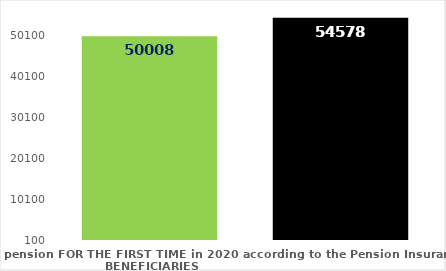
| Category | broj korisnika |
|---|---|
| Pension beneficiaries entitled to pension FOR THE FIRST TIME in 2020 according to the Pension Insurance Act  - NEW BENEFICIARIES | 50008 |
| Pension beneficiaries whose pension entitlement ceased in 2020  -  death caused,   
and who were retired according to the Pension Insurance Act   | 54578 |